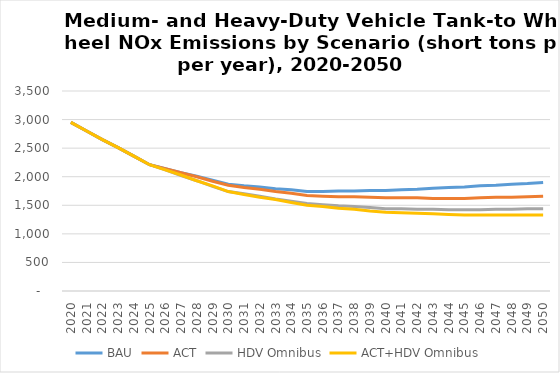
| Category | BAU | ACT | HDV Omnibus | ACT+HDV Omnibus |
|---|---|---|---|---|
| 2020.0 | 2950 | 2950 | 2950 | 2950 |
| 2021.0 | 2800 | 2800 | 2800 | 2800 |
| 2022.0 | 2650 | 2650 | 2650 | 2650 |
| 2023.0 | 2510 | 2510 | 2510 | 2510 |
| 2024.0 | 2360 | 2360 | 2360 | 2360 |
| 2025.0 | 2210 | 2210 | 2210 | 2210 |
| 2026.0 | 2140 | 2140 | 2120 | 2120 |
| 2027.0 | 2070 | 2070 | 2020 | 2030 |
| 2028.0 | 2010 | 2000 | 1930 | 1930 |
| 2029.0 | 1940 | 1920 | 1830 | 1840 |
| 2030.0 | 1870 | 1850 | 1740 | 1740 |
| 2031.0 | 1840 | 1810 | 1700 | 1690 |
| 2032.0 | 1820 | 1780 | 1660 | 1640 |
| 2033.0 | 1790 | 1740 | 1610 | 1600 |
| 2034.0 | 1770 | 1710 | 1570 | 1550 |
| 2035.0 | 1740 | 1670 | 1530 | 1500 |
| 2036.0 | 1740 | 1660 | 1510 | 1480 |
| 2037.0 | 1750 | 1650 | 1490 | 1450 |
| 2038.0 | 1750 | 1650 | 1480 | 1430 |
| 2039.0 | 1760 | 1640 | 1460 | 1400 |
| 2040.0 | 1760 | 1630 | 1440 | 1380 |
| 2041.0 | 1770 | 1630 | 1440 | 1370 |
| 2042.0 | 1780 | 1630 | 1430 | 1360 |
| 2043.0 | 1800 | 1620 | 1430 | 1350 |
| 2044.0 | 1810 | 1620 | 1420 | 1340 |
| 2045.0 | 1820 | 1620 | 1420 | 1330 |
| 2046.0 | 1840 | 1630 | 1420 | 1330 |
| 2047.0 | 1850 | 1640 | 1430 | 1330 |
| 2048.0 | 1870 | 1640 | 1430 | 1330 |
| 2049.0 | 1880 | 1650 | 1440 | 1330 |
| 2050.0 | 1900 | 1660 | 1440 | 1330 |